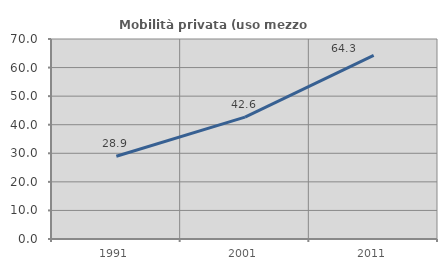
| Category | Mobilità privata (uso mezzo privato) |
|---|---|
| 1991.0 | 28.947 |
| 2001.0 | 42.647 |
| 2011.0 | 64.286 |